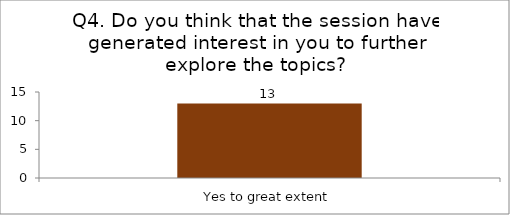
| Category | Q4. Do you think that the session have generated interest in you to further explore the topics? |
|---|---|
| Yes to great extent | 13 |